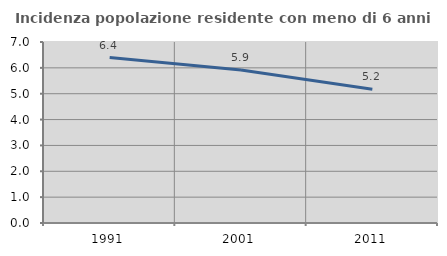
| Category | Incidenza popolazione residente con meno di 6 anni |
|---|---|
| 1991.0 | 6.399 |
| 2001.0 | 5.921 |
| 2011.0 | 5.17 |